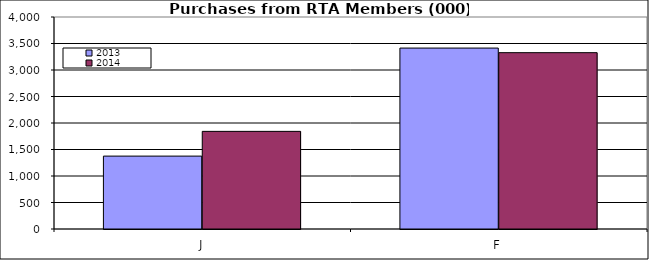
| Category | 2013 | 2014 |
|---|---|---|
| J | 1375.298 | 1842.078 |
| F | 3413.689 | 3327.055 |